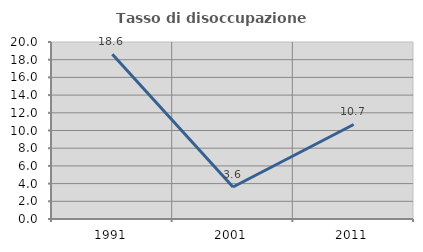
| Category | Tasso di disoccupazione giovanile  |
|---|---|
| 1991.0 | 18.615 |
| 2001.0 | 3.614 |
| 2011.0 | 10.68 |